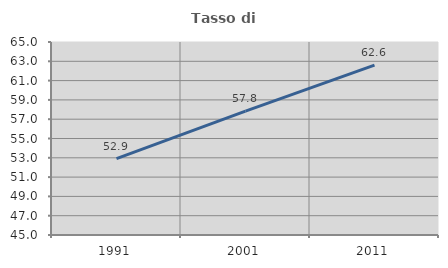
| Category | Tasso di occupazione   |
|---|---|
| 1991.0 | 52.906 |
| 2001.0 | 57.838 |
| 2011.0 | 62.602 |